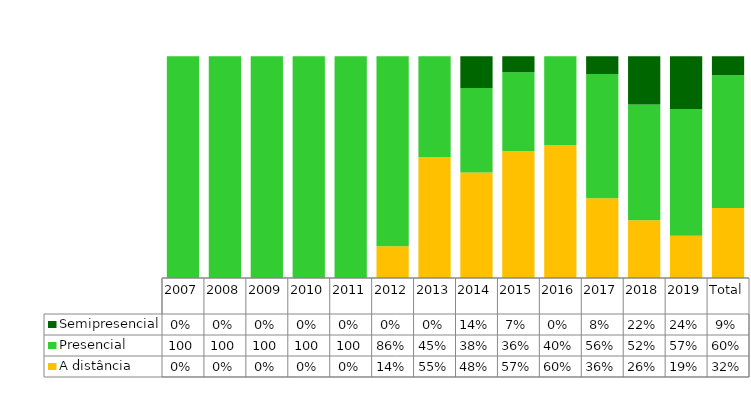
| Category | A distância | Presencial | Semipresencial |
|---|---|---|---|
| 2007 | 0 | 1 | 0 |
| 2008 | 0 | 1 | 0 |
| 2009 | 0 | 1 | 0 |
| 2010 | 0 | 1 | 0 |
| 2011 | 0 | 1 | 0 |
| 2012 | 0.143 | 0.857 | 0 |
| 2013 | 0.545 | 0.455 | 0 |
| 2014 | 0.476 | 0.381 | 0.143 |
| 2015 | 0.571 | 0.357 | 0.071 |
| 2016 | 0.6 | 0.4 | 0 |
| 2017 | 0.36 | 0.56 | 0.08 |
| 2018 | 0.261 | 0.522 | 0.217 |
| 2019 | 0.19 | 0.571 | 0.238 |
| Total | 0.316 | 0.599 | 0.086 |